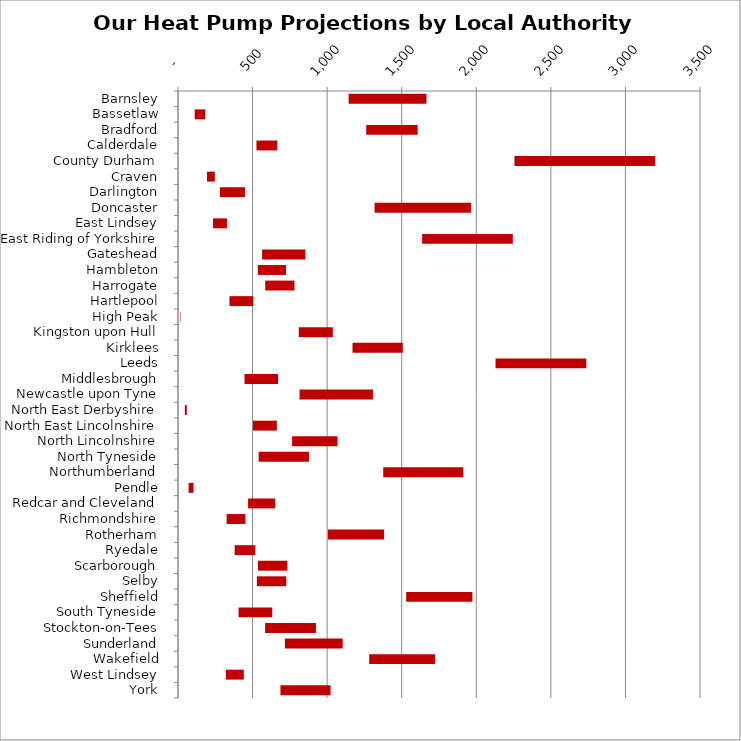
| Category | MIN | MAX |
|---|---|---|
| Barnsley | 1144 | 522 |
| Bassetlaw | 112 | 71 |
| Bradford | 1262 | 345 |
| Calderdale | 526 | 140 |
| County Durham | 2256 | 943 |
| Craven | 194 | 53 |
| Darlington | 281 | 168 |
| Doncaster | 1318 | 647 |
| East Lindsey | 235 | 93 |
| East Riding of Yorkshire | 1637 | 608 |
| Gateshead | 564 | 290 |
| Hambleton | 535 | 189 |
| Harrogate | 585 | 196 |
| Hartlepool | 345 | 160 |
| High Peak | 14 | 3 |
| Kingston upon Hull | 810 | 228 |
| Kirklees | 1170 | 337 |
| Leeds | 2129 | 609 |
| Middlesbrough | 446 | 225 |
| Newcastle upon Tyne | 815 | 492 |
| North East Derbyshire | 46 | 13 |
| North East Lincolnshire | 503 | 160 |
| North Lincolnshire | 765 | 305 |
| North Tyneside | 541 | 337 |
| Northumberland | 1376 | 537 |
| Pendle | 71 | 33 |
| Redcar and Cleveland | 470 | 182 |
| Richmondshire | 326 | 126 |
| Rotherham | 1005 | 377 |
| Ryedale | 380 | 138 |
| Scarborough | 536 | 197 |
| Selby | 529 | 197 |
| Sheffield | 1530 | 444 |
| South Tyneside | 406 | 226 |
| Stockton-on-Tees | 584 | 341 |
| Sunderland | 717 | 387 |
| Wakefield | 1282 | 442 |
| West Lindsey | 321 | 120 |
| York | 687 | 336 |